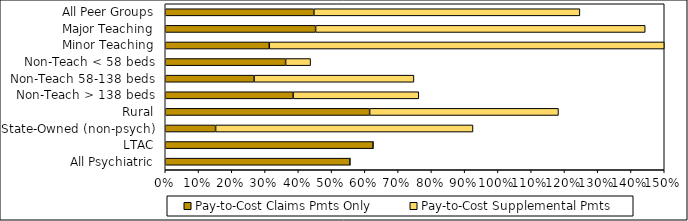
| Category | Pay-to-Cost Claims Pmts Only | Pay-to-Cost Supplemental Pmts |
|---|---|---|
| All Peer Groups | 0.447 | 0.8 |
| Major Teaching | 0.452 | 0.991 |
| Minor Teaching | 0.313 | 2.01 |
| Non-Teach < 58 beds | 0.362 | 0.075 |
| Non-Teach 58-138 beds | 0.267 | 0.481 |
| Non-Teach > 138 beds | 0.384 | 0.378 |
| Rural | 0.614 | 0.568 |
| State-Owned (non-psych) | 0.151 | 0.774 |
| LTAC | 0.625 | 0 |
| All Psychiatric | 0.555 | 0 |